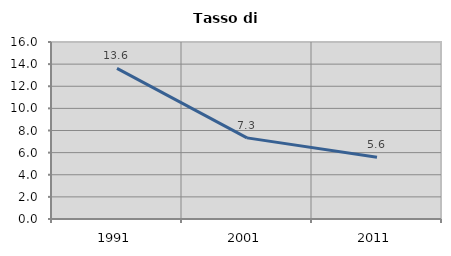
| Category | Tasso di disoccupazione   |
|---|---|
| 1991.0 | 13.61 |
| 2001.0 | 7.332 |
| 2011.0 | 5.573 |